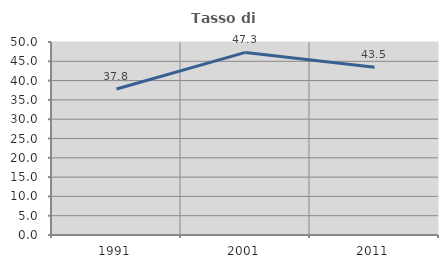
| Category | Tasso di occupazione   |
|---|---|
| 1991.0 | 37.829 |
| 2001.0 | 47.305 |
| 2011.0 | 43.465 |